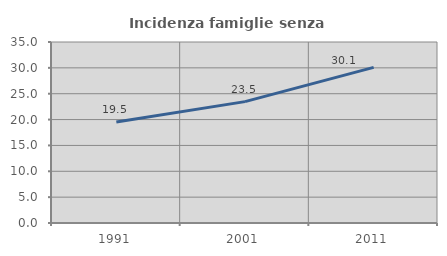
| Category | Incidenza famiglie senza nuclei |
|---|---|
| 1991.0 | 19.542 |
| 2001.0 | 23.47 |
| 2011.0 | 30.087 |